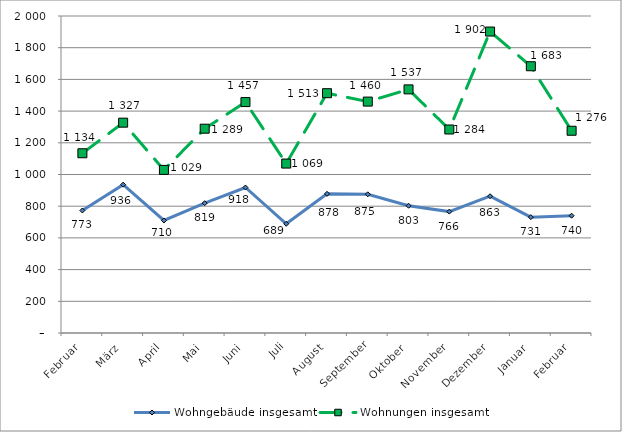
| Category | Wohngebäude insgesamt | Wohnungen insgesamt |
|---|---|---|
| Februar | 773 | 1134 |
| März | 936 | 1327 |
| April | 710 | 1029 |
| Mai | 819 | 1289 |
| Juni | 918 | 1457 |
| Juli | 689 | 1069 |
| August | 878 | 1513 |
| September | 875 | 1460 |
| Oktober | 803 | 1537 |
| November | 766 | 1284 |
| Dezember | 863 | 1902 |
| Januar | 731 | 1683 |
| Februar | 740 | 1276 |